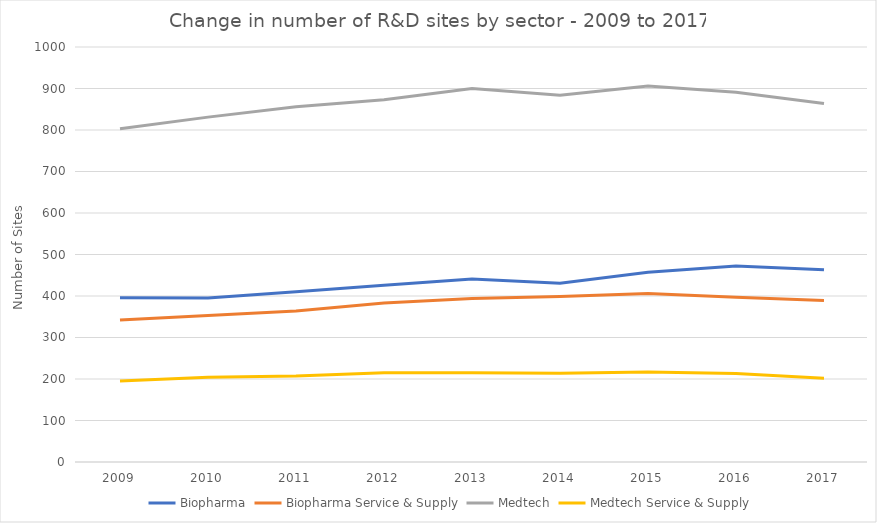
| Category | Biopharma | Biopharma Service & Supply | Medtech | Medtech Service & Supply |
|---|---|---|---|---|
| 2009 | 396 | 342 | 803 | 195 |
| 2010 | 395 | 353 | 831 | 204 |
| 2011 | 410 | 364 | 856 | 207 |
| 2012 | 426 | 383 | 873 | 215 |
| 2013 | 441 | 394 | 900 | 215 |
| 2014 | 431 | 399 | 884 | 214 |
| 2015 | 457 | 406 | 906 | 217 |
| 2016 | 472 | 397 | 891 | 213 |
| 2017 | 463 | 389 | 864 | 202 |